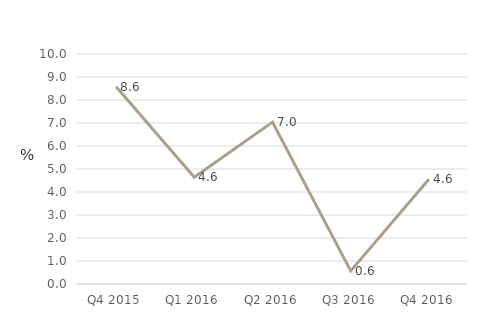
| Category | Financial and insurance activities |
|---|---|
| Q4 2015 | 8.576 |
| Q1 2016 | 4.643 |
| Q2 2016 | 7.039 |
| Q3 2016 | 0.569 |
| Q4 2016 | 4.551 |